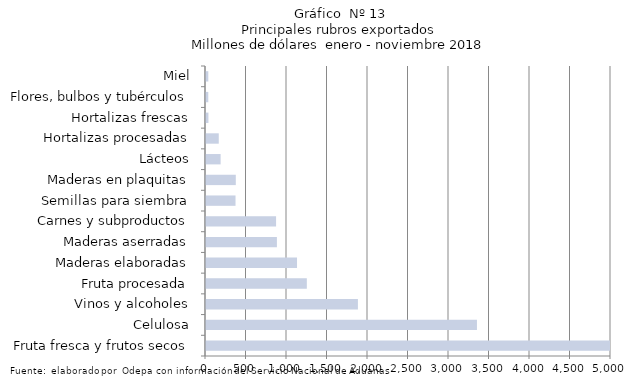
| Category | Series 7 |
|---|---|
| Fruta fresca y frutos secos | 5131486.35 |
| Celulosa | 3345120.204 |
| Vinos y alcoholes | 1875523.209 |
| Fruta procesada | 1244825.146 |
| Maderas elaboradas | 1123618.715 |
| Maderas aserradas | 875474.235 |
| Carnes y subproductos | 865081.03 |
| Semillas para siembra | 364452.617 |
| Maderas en plaquitas | 367907.472 |
| Lácteos | 180489.735 |
| Hortalizas procesadas | 157558.358 |
| Hortalizas frescas | 29903.628 |
| Flores, bulbos y tubérculos | 28114.198 |
| Miel | 28338.894 |